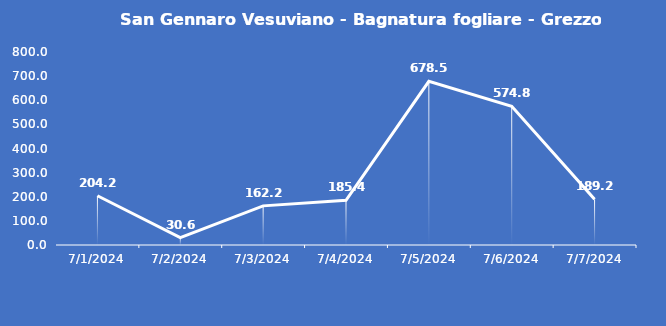
| Category | San Gennaro Vesuviano - Bagnatura fogliare - Grezzo (min) |
|---|---|
| 7/1/24 | 204.2 |
| 7/2/24 | 30.6 |
| 7/3/24 | 162.2 |
| 7/4/24 | 185.4 |
| 7/5/24 | 678.5 |
| 7/6/24 | 574.8 |
| 7/7/24 | 189.2 |